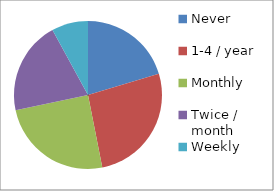
| Category | Series 0 |
|---|---|
| Never | 23 |
| 1-4 / year | 30 |
| Monthly | 28 |
| Twice / month | 23 |
| Weekly | 9 |